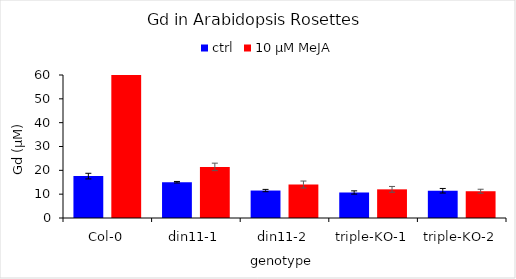
| Category | ctrl | 10 µM MeJA |
|---|---|---|
| Col-0 | 17.574 | 289.254 |
| din11-1 | 15.012 | 21.441 |
| din11-2 | 11.522 | 14.055 |
| triple-KO-1 | 10.704 | 12.024 |
| triple-KO-2 | 11.436 | 11.231 |